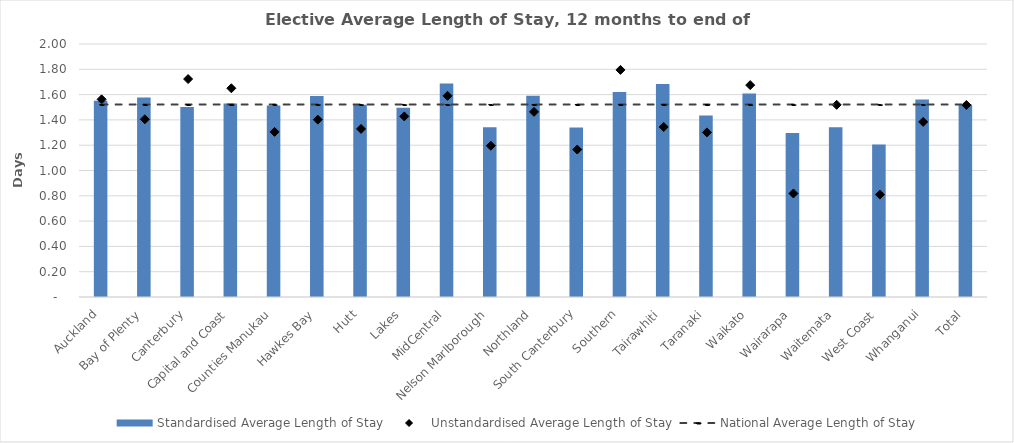
| Category | Standardised Average Length of Stay |
|---|---|
| Auckland | 1.551 |
| Bay of Plenty | 1.577 |
| Canterbury | 1.503 |
| Capital and Coast | 1.529 |
| Counties Manukau | 1.513 |
| Hawkes Bay | 1.589 |
| Hutt | 1.52 |
| Lakes | 1.497 |
| MidCentral | 1.687 |
| Nelson Marlborough | 1.341 |
| Northland | 1.59 |
| South Canterbury | 1.339 |
| Southern | 1.62 |
| Tairawhiti | 1.683 |
| Taranaki | 1.435 |
| Waikato | 1.608 |
| Wairarapa | 1.295 |
| Waitemata | 1.342 |
| West Coast | 1.205 |
| Whanganui | 1.561 |
| Total | 1.522 |